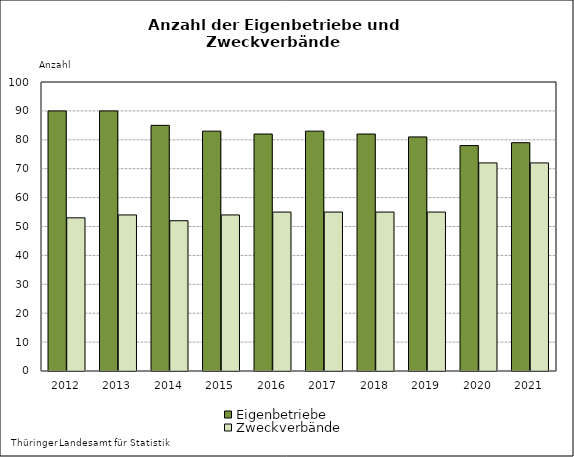
| Category | Eigenbetriebe | Zweckverbände |
|---|---|---|
| 2012.0 | 90 | 53 |
| 2013.0 | 90 | 54 |
| 2014.0 | 85 | 52 |
| 2015.0 | 83 | 54 |
| 2016.0 | 82 | 55 |
| 2017.0 | 83 | 55 |
| 2018.0 | 82 | 55 |
| 2019.0 | 81 | 55 |
| 2020.0 | 78 | 72 |
| 2021.0 | 79 | 72 |